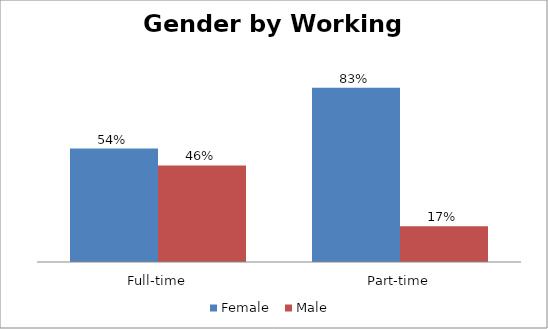
| Category | Female | Male |
|---|---|---|
| Full-time | 0.54 | 0.46 |
| Part-time | 0.83 | 0.17 |